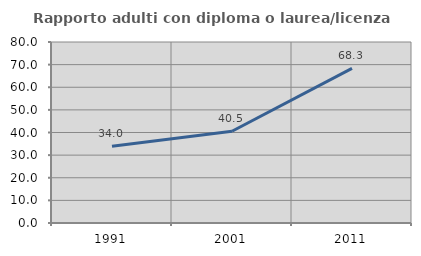
| Category | Rapporto adulti con diploma o laurea/licenza media  |
|---|---|
| 1991.0 | 33.962 |
| 2001.0 | 40.541 |
| 2011.0 | 68.333 |